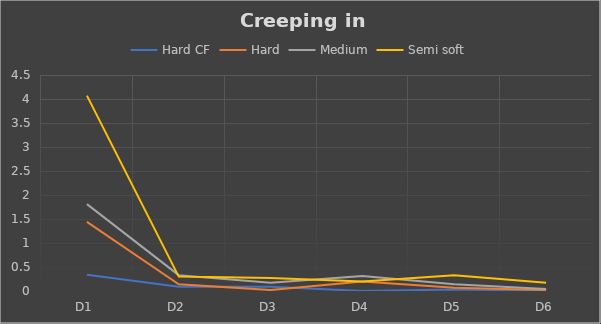
| Category | Hard CF | Hard | Medium | Semi soft |
|---|---|---|---|---|
| D1 | 0.34 | 1.44 | 1.81 | 4.07 |
| D2 | 0.09 | 0.14 | 0.33 | 0.3 |
| D3 | 0.09 | 0.02 | 0.17 | 0.27 |
| D4 | 0 | 0.2 | 0.31 | 0.2 |
| D5 | 0.03 | 0.07 | 0.14 | 0.33 |
| D6 | 0.01 | 0.02 | 0.04 | 0.17 |